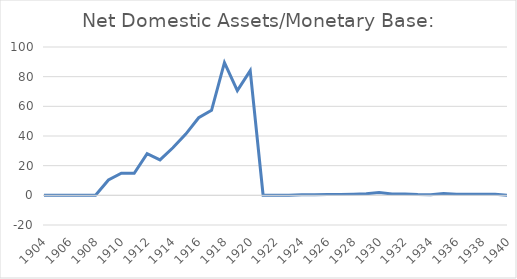
| Category | Net Domestic Assets/Monetary Base: |
|---|---|
| 1904.0 | 0 |
| 1905.0 | 0 |
| 1906.0 | 0 |
| 1907.0 | 0.003 |
| 1908.0 | 0 |
| 1909.0 | 10.355 |
| 1910.0 | 14.927 |
| 1911.0 | 14.862 |
| 1912.0 | 28.142 |
| 1913.0 | 23.923 |
| 1914.0 | 32.083 |
| 1915.0 | 41.293 |
| 1916.0 | 52.285 |
| 1917.0 | 57.276 |
| 1918.0 | 89.478 |
| 1919.0 | 70.595 |
| 1920.0 | 84.094 |
| 1921.0 | 0.1 |
| 1922.0 | 0.013 |
| 1923.0 | -0.008 |
| 1924.0 | 0.397 |
| 1925.0 | 0.391 |
| 1926.0 | 0.577 |
| 1927.0 | 0.578 |
| 1928.0 | 0.754 |
| 1929.0 | 1.107 |
| 1930.0 | 1.86 |
| 1931.0 | 0.933 |
| 1932.0 | 0.953 |
| 1933.0 | 0.567 |
| 1934.0 | 0.467 |
| 1935.0 | 1.235 |
| 1936.0 | 0.692 |
| 1937.0 | 0.744 |
| 1938.0 | 0.735 |
| 1939.0 | 0.735 |
| 1940.0 | 0.076 |